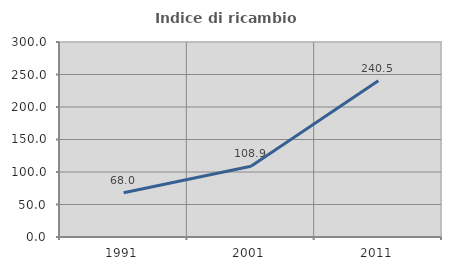
| Category | Indice di ricambio occupazionale  |
|---|---|
| 1991.0 | 67.978 |
| 2001.0 | 108.917 |
| 2011.0 | 240.541 |